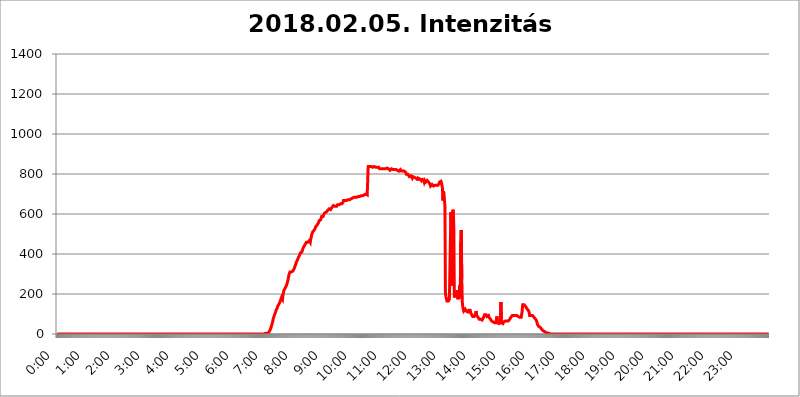
| Category | 2018.02.05. Intenzitás [W/m^2] |
|---|---|
| 0.0 | 0 |
| 0.0006944444444444445 | 0 |
| 0.001388888888888889 | 0 |
| 0.0020833333333333333 | 0 |
| 0.002777777777777778 | 0 |
| 0.003472222222222222 | 0 |
| 0.004166666666666667 | 0 |
| 0.004861111111111111 | 0 |
| 0.005555555555555556 | 0 |
| 0.0062499999999999995 | 0 |
| 0.006944444444444444 | 0 |
| 0.007638888888888889 | 0 |
| 0.008333333333333333 | 0 |
| 0.009027777777777779 | 0 |
| 0.009722222222222222 | 0 |
| 0.010416666666666666 | 0 |
| 0.011111111111111112 | 0 |
| 0.011805555555555555 | 0 |
| 0.012499999999999999 | 0 |
| 0.013194444444444444 | 0 |
| 0.013888888888888888 | 0 |
| 0.014583333333333332 | 0 |
| 0.015277777777777777 | 0 |
| 0.015972222222222224 | 0 |
| 0.016666666666666666 | 0 |
| 0.017361111111111112 | 0 |
| 0.018055555555555557 | 0 |
| 0.01875 | 0 |
| 0.019444444444444445 | 0 |
| 0.02013888888888889 | 0 |
| 0.020833333333333332 | 0 |
| 0.02152777777777778 | 0 |
| 0.022222222222222223 | 0 |
| 0.02291666666666667 | 0 |
| 0.02361111111111111 | 0 |
| 0.024305555555555556 | 0 |
| 0.024999999999999998 | 0 |
| 0.025694444444444447 | 0 |
| 0.02638888888888889 | 0 |
| 0.027083333333333334 | 0 |
| 0.027777777777777776 | 0 |
| 0.02847222222222222 | 0 |
| 0.029166666666666664 | 0 |
| 0.029861111111111113 | 0 |
| 0.030555555555555555 | 0 |
| 0.03125 | 0 |
| 0.03194444444444445 | 0 |
| 0.03263888888888889 | 0 |
| 0.03333333333333333 | 0 |
| 0.034027777777777775 | 0 |
| 0.034722222222222224 | 0 |
| 0.035416666666666666 | 0 |
| 0.036111111111111115 | 0 |
| 0.03680555555555556 | 0 |
| 0.0375 | 0 |
| 0.03819444444444444 | 0 |
| 0.03888888888888889 | 0 |
| 0.03958333333333333 | 0 |
| 0.04027777777777778 | 0 |
| 0.04097222222222222 | 0 |
| 0.041666666666666664 | 0 |
| 0.042361111111111106 | 0 |
| 0.04305555555555556 | 0 |
| 0.043750000000000004 | 0 |
| 0.044444444444444446 | 0 |
| 0.04513888888888889 | 0 |
| 0.04583333333333334 | 0 |
| 0.04652777777777778 | 0 |
| 0.04722222222222222 | 0 |
| 0.04791666666666666 | 0 |
| 0.04861111111111111 | 0 |
| 0.049305555555555554 | 0 |
| 0.049999999999999996 | 0 |
| 0.05069444444444445 | 0 |
| 0.051388888888888894 | 0 |
| 0.052083333333333336 | 0 |
| 0.05277777777777778 | 0 |
| 0.05347222222222222 | 0 |
| 0.05416666666666667 | 0 |
| 0.05486111111111111 | 0 |
| 0.05555555555555555 | 0 |
| 0.05625 | 0 |
| 0.05694444444444444 | 0 |
| 0.057638888888888885 | 0 |
| 0.05833333333333333 | 0 |
| 0.05902777777777778 | 0 |
| 0.059722222222222225 | 0 |
| 0.06041666666666667 | 0 |
| 0.061111111111111116 | 0 |
| 0.06180555555555556 | 0 |
| 0.0625 | 0 |
| 0.06319444444444444 | 0 |
| 0.06388888888888888 | 0 |
| 0.06458333333333334 | 0 |
| 0.06527777777777778 | 0 |
| 0.06597222222222222 | 0 |
| 0.06666666666666667 | 0 |
| 0.06736111111111111 | 0 |
| 0.06805555555555555 | 0 |
| 0.06874999999999999 | 0 |
| 0.06944444444444443 | 0 |
| 0.07013888888888889 | 0 |
| 0.07083333333333333 | 0 |
| 0.07152777777777779 | 0 |
| 0.07222222222222223 | 0 |
| 0.07291666666666667 | 0 |
| 0.07361111111111111 | 0 |
| 0.07430555555555556 | 0 |
| 0.075 | 0 |
| 0.07569444444444444 | 0 |
| 0.0763888888888889 | 0 |
| 0.07708333333333334 | 0 |
| 0.07777777777777778 | 0 |
| 0.07847222222222222 | 0 |
| 0.07916666666666666 | 0 |
| 0.0798611111111111 | 0 |
| 0.08055555555555556 | 0 |
| 0.08125 | 0 |
| 0.08194444444444444 | 0 |
| 0.08263888888888889 | 0 |
| 0.08333333333333333 | 0 |
| 0.08402777777777777 | 0 |
| 0.08472222222222221 | 0 |
| 0.08541666666666665 | 0 |
| 0.08611111111111112 | 0 |
| 0.08680555555555557 | 0 |
| 0.08750000000000001 | 0 |
| 0.08819444444444445 | 0 |
| 0.08888888888888889 | 0 |
| 0.08958333333333333 | 0 |
| 0.09027777777777778 | 0 |
| 0.09097222222222222 | 0 |
| 0.09166666666666667 | 0 |
| 0.09236111111111112 | 0 |
| 0.09305555555555556 | 0 |
| 0.09375 | 0 |
| 0.09444444444444444 | 0 |
| 0.09513888888888888 | 0 |
| 0.09583333333333333 | 0 |
| 0.09652777777777777 | 0 |
| 0.09722222222222222 | 0 |
| 0.09791666666666667 | 0 |
| 0.09861111111111111 | 0 |
| 0.09930555555555555 | 0 |
| 0.09999999999999999 | 0 |
| 0.10069444444444443 | 0 |
| 0.1013888888888889 | 0 |
| 0.10208333333333335 | 0 |
| 0.10277777777777779 | 0 |
| 0.10347222222222223 | 0 |
| 0.10416666666666667 | 0 |
| 0.10486111111111111 | 0 |
| 0.10555555555555556 | 0 |
| 0.10625 | 0 |
| 0.10694444444444444 | 0 |
| 0.1076388888888889 | 0 |
| 0.10833333333333334 | 0 |
| 0.10902777777777778 | 0 |
| 0.10972222222222222 | 0 |
| 0.1111111111111111 | 0 |
| 0.11180555555555556 | 0 |
| 0.11180555555555556 | 0 |
| 0.1125 | 0 |
| 0.11319444444444444 | 0 |
| 0.11388888888888889 | 0 |
| 0.11458333333333333 | 0 |
| 0.11527777777777777 | 0 |
| 0.11597222222222221 | 0 |
| 0.11666666666666665 | 0 |
| 0.1173611111111111 | 0 |
| 0.11805555555555557 | 0 |
| 0.11944444444444445 | 0 |
| 0.12013888888888889 | 0 |
| 0.12083333333333333 | 0 |
| 0.12152777777777778 | 0 |
| 0.12222222222222223 | 0 |
| 0.12291666666666667 | 0 |
| 0.12291666666666667 | 0 |
| 0.12361111111111112 | 0 |
| 0.12430555555555556 | 0 |
| 0.125 | 0 |
| 0.12569444444444444 | 0 |
| 0.12638888888888888 | 0 |
| 0.12708333333333333 | 0 |
| 0.16875 | 0 |
| 0.12847222222222224 | 0 |
| 0.12916666666666668 | 0 |
| 0.12986111111111112 | 0 |
| 0.13055555555555556 | 0 |
| 0.13125 | 0 |
| 0.13194444444444445 | 0 |
| 0.1326388888888889 | 0 |
| 0.13333333333333333 | 0 |
| 0.13402777777777777 | 0 |
| 0.13402777777777777 | 0 |
| 0.13472222222222222 | 0 |
| 0.13541666666666666 | 0 |
| 0.1361111111111111 | 0 |
| 0.13749999999999998 | 0 |
| 0.13819444444444443 | 0 |
| 0.1388888888888889 | 0 |
| 0.13958333333333334 | 0 |
| 0.14027777777777778 | 0 |
| 0.14097222222222222 | 0 |
| 0.14166666666666666 | 0 |
| 0.1423611111111111 | 0 |
| 0.14305555555555557 | 0 |
| 0.14375000000000002 | 0 |
| 0.14444444444444446 | 0 |
| 0.1451388888888889 | 0 |
| 0.1451388888888889 | 0 |
| 0.14652777777777778 | 0 |
| 0.14722222222222223 | 0 |
| 0.14791666666666667 | 0 |
| 0.1486111111111111 | 0 |
| 0.14930555555555555 | 0 |
| 0.15 | 0 |
| 0.15069444444444444 | 0 |
| 0.15138888888888888 | 0 |
| 0.15208333333333332 | 0 |
| 0.15277777777777776 | 0 |
| 0.15347222222222223 | 0 |
| 0.15416666666666667 | 0 |
| 0.15486111111111112 | 0 |
| 0.15555555555555556 | 0 |
| 0.15625 | 0 |
| 0.15694444444444444 | 0 |
| 0.15763888888888888 | 0 |
| 0.15833333333333333 | 0 |
| 0.15902777777777777 | 0 |
| 0.15972222222222224 | 0 |
| 0.16041666666666668 | 0 |
| 0.16111111111111112 | 0 |
| 0.16180555555555556 | 0 |
| 0.1625 | 0 |
| 0.16319444444444445 | 0 |
| 0.1638888888888889 | 0 |
| 0.16458333333333333 | 0 |
| 0.16527777777777777 | 0 |
| 0.16597222222222222 | 0 |
| 0.16666666666666666 | 0 |
| 0.1673611111111111 | 0 |
| 0.16805555555555554 | 0 |
| 0.16874999999999998 | 0 |
| 0.16944444444444443 | 0 |
| 0.17013888888888887 | 0 |
| 0.1708333333333333 | 0 |
| 0.17152777777777775 | 0 |
| 0.17222222222222225 | 0 |
| 0.1729166666666667 | 0 |
| 0.17361111111111113 | 0 |
| 0.17430555555555557 | 0 |
| 0.17500000000000002 | 0 |
| 0.17569444444444446 | 0 |
| 0.1763888888888889 | 0 |
| 0.17708333333333334 | 0 |
| 0.17777777777777778 | 0 |
| 0.17847222222222223 | 0 |
| 0.17916666666666667 | 0 |
| 0.1798611111111111 | 0 |
| 0.18055555555555555 | 0 |
| 0.18125 | 0 |
| 0.18194444444444444 | 0 |
| 0.1826388888888889 | 0 |
| 0.18333333333333335 | 0 |
| 0.1840277777777778 | 0 |
| 0.18472222222222223 | 0 |
| 0.18541666666666667 | 0 |
| 0.18611111111111112 | 0 |
| 0.18680555555555556 | 0 |
| 0.1875 | 0 |
| 0.18819444444444444 | 0 |
| 0.18888888888888888 | 0 |
| 0.18958333333333333 | 0 |
| 0.19027777777777777 | 0 |
| 0.1909722222222222 | 0 |
| 0.19166666666666665 | 0 |
| 0.19236111111111112 | 0 |
| 0.19305555555555554 | 0 |
| 0.19375 | 0 |
| 0.19444444444444445 | 0 |
| 0.1951388888888889 | 0 |
| 0.19583333333333333 | 0 |
| 0.19652777777777777 | 0 |
| 0.19722222222222222 | 0 |
| 0.19791666666666666 | 0 |
| 0.1986111111111111 | 0 |
| 0.19930555555555554 | 0 |
| 0.19999999999999998 | 0 |
| 0.20069444444444443 | 0 |
| 0.20138888888888887 | 0 |
| 0.2020833333333333 | 0 |
| 0.2027777777777778 | 0 |
| 0.2034722222222222 | 0 |
| 0.2041666666666667 | 0 |
| 0.20486111111111113 | 0 |
| 0.20555555555555557 | 0 |
| 0.20625000000000002 | 0 |
| 0.20694444444444446 | 0 |
| 0.2076388888888889 | 0 |
| 0.20833333333333334 | 0 |
| 0.20902777777777778 | 0 |
| 0.20972222222222223 | 0 |
| 0.21041666666666667 | 0 |
| 0.2111111111111111 | 0 |
| 0.21180555555555555 | 0 |
| 0.2125 | 0 |
| 0.21319444444444444 | 0 |
| 0.2138888888888889 | 0 |
| 0.21458333333333335 | 0 |
| 0.2152777777777778 | 0 |
| 0.21597222222222223 | 0 |
| 0.21666666666666667 | 0 |
| 0.21736111111111112 | 0 |
| 0.21805555555555556 | 0 |
| 0.21875 | 0 |
| 0.21944444444444444 | 0 |
| 0.22013888888888888 | 0 |
| 0.22083333333333333 | 0 |
| 0.22152777777777777 | 0 |
| 0.2222222222222222 | 0 |
| 0.22291666666666665 | 0 |
| 0.2236111111111111 | 0 |
| 0.22430555555555556 | 0 |
| 0.225 | 0 |
| 0.22569444444444445 | 0 |
| 0.2263888888888889 | 0 |
| 0.22708333333333333 | 0 |
| 0.22777777777777777 | 0 |
| 0.22847222222222222 | 0 |
| 0.22916666666666666 | 0 |
| 0.2298611111111111 | 0 |
| 0.23055555555555554 | 0 |
| 0.23124999999999998 | 0 |
| 0.23194444444444443 | 0 |
| 0.23263888888888887 | 0 |
| 0.2333333333333333 | 0 |
| 0.2340277777777778 | 0 |
| 0.2347222222222222 | 0 |
| 0.2354166666666667 | 0 |
| 0.23611111111111113 | 0 |
| 0.23680555555555557 | 0 |
| 0.23750000000000002 | 0 |
| 0.23819444444444446 | 0 |
| 0.2388888888888889 | 0 |
| 0.23958333333333334 | 0 |
| 0.24027777777777778 | 0 |
| 0.24097222222222223 | 0 |
| 0.24166666666666667 | 0 |
| 0.2423611111111111 | 0 |
| 0.24305555555555555 | 0 |
| 0.24375 | 0 |
| 0.24444444444444446 | 0 |
| 0.24513888888888888 | 0 |
| 0.24583333333333335 | 0 |
| 0.2465277777777778 | 0 |
| 0.24722222222222223 | 0 |
| 0.24791666666666667 | 0 |
| 0.24861111111111112 | 0 |
| 0.24930555555555556 | 0 |
| 0.25 | 0 |
| 0.25069444444444444 | 0 |
| 0.2513888888888889 | 0 |
| 0.2520833333333333 | 0 |
| 0.25277777777777777 | 0 |
| 0.2534722222222222 | 0 |
| 0.25416666666666665 | 0 |
| 0.2548611111111111 | 0 |
| 0.2555555555555556 | 0 |
| 0.25625000000000003 | 0 |
| 0.2569444444444445 | 0 |
| 0.2576388888888889 | 0 |
| 0.25833333333333336 | 0 |
| 0.2590277777777778 | 0 |
| 0.25972222222222224 | 0 |
| 0.2604166666666667 | 0 |
| 0.2611111111111111 | 0 |
| 0.26180555555555557 | 0 |
| 0.2625 | 0 |
| 0.26319444444444445 | 0 |
| 0.2638888888888889 | 0 |
| 0.26458333333333334 | 0 |
| 0.2652777777777778 | 0 |
| 0.2659722222222222 | 0 |
| 0.26666666666666666 | 0 |
| 0.2673611111111111 | 0 |
| 0.26805555555555555 | 0 |
| 0.26875 | 0 |
| 0.26944444444444443 | 0 |
| 0.2701388888888889 | 0 |
| 0.2708333333333333 | 0 |
| 0.27152777777777776 | 0 |
| 0.2722222222222222 | 0 |
| 0.27291666666666664 | 0 |
| 0.2736111111111111 | 0 |
| 0.2743055555555555 | 0 |
| 0.27499999999999997 | 0 |
| 0.27569444444444446 | 0 |
| 0.27638888888888885 | 0 |
| 0.27708333333333335 | 0 |
| 0.2777777777777778 | 0 |
| 0.27847222222222223 | 0 |
| 0.2791666666666667 | 0 |
| 0.2798611111111111 | 0 |
| 0.28055555555555556 | 0 |
| 0.28125 | 0 |
| 0.28194444444444444 | 0 |
| 0.2826388888888889 | 0 |
| 0.2833333333333333 | 0 |
| 0.28402777777777777 | 0 |
| 0.2847222222222222 | 0 |
| 0.28541666666666665 | 0 |
| 0.28611111111111115 | 0 |
| 0.28680555555555554 | 0 |
| 0.28750000000000003 | 0 |
| 0.2881944444444445 | 0 |
| 0.2888888888888889 | 0 |
| 0.28958333333333336 | 0 |
| 0.2902777777777778 | 0 |
| 0.29097222222222224 | 3.525 |
| 0.2916666666666667 | 3.525 |
| 0.2923611111111111 | 3.525 |
| 0.29305555555555557 | 3.525 |
| 0.29375 | 3.525 |
| 0.29444444444444445 | 3.525 |
| 0.2951388888888889 | 7.887 |
| 0.29583333333333334 | 3.525 |
| 0.2965277777777778 | 7.887 |
| 0.2972222222222222 | 12.257 |
| 0.29791666666666666 | 12.257 |
| 0.2986111111111111 | 21.024 |
| 0.29930555555555555 | 25.419 |
| 0.3 | 34.234 |
| 0.30069444444444443 | 43.079 |
| 0.3013888888888889 | 51.951 |
| 0.3020833333333333 | 60.85 |
| 0.30277777777777776 | 74.246 |
| 0.3034722222222222 | 83.205 |
| 0.30416666666666664 | 87.692 |
| 0.3048611111111111 | 96.682 |
| 0.3055555555555555 | 101.184 |
| 0.30624999999999997 | 110.201 |
| 0.3069444444444444 | 119.235 |
| 0.3076388888888889 | 123.758 |
| 0.30833333333333335 | 128.284 |
| 0.3090277777777778 | 137.347 |
| 0.30972222222222223 | 141.884 |
| 0.3104166666666667 | 146.423 |
| 0.3111111111111111 | 150.964 |
| 0.31180555555555556 | 155.509 |
| 0.3125 | 160.056 |
| 0.31319444444444444 | 169.156 |
| 0.3138888888888889 | 173.709 |
| 0.3145833333333333 | 182.82 |
| 0.31527777777777777 | 187.378 |
| 0.3159722222222222 | 173.709 |
| 0.31666666666666665 | 196.497 |
| 0.31736111111111115 | 210.182 |
| 0.31805555555555554 | 219.309 |
| 0.31875000000000003 | 223.873 |
| 0.3194444444444445 | 228.436 |
| 0.3201388888888889 | 233 |
| 0.32083333333333336 | 237.564 |
| 0.3215277777777778 | 242.127 |
| 0.32222222222222224 | 251.251 |
| 0.3229166666666667 | 260.373 |
| 0.3236111111111111 | 269.49 |
| 0.32430555555555557 | 283.156 |
| 0.325 | 296.808 |
| 0.32569444444444445 | 301.354 |
| 0.3263888888888889 | 310.44 |
| 0.32708333333333334 | 310.44 |
| 0.3277777777777778 | 314.98 |
| 0.3284722222222222 | 310.44 |
| 0.32916666666666666 | 314.98 |
| 0.3298611111111111 | 314.98 |
| 0.33055555555555555 | 314.98 |
| 0.33125 | 314.98 |
| 0.33194444444444443 | 324.052 |
| 0.3326388888888889 | 328.584 |
| 0.3333333333333333 | 337.639 |
| 0.3340277777777778 | 342.162 |
| 0.3347222222222222 | 351.198 |
| 0.3354166666666667 | 360.221 |
| 0.3361111111111111 | 364.728 |
| 0.3368055555555556 | 369.23 |
| 0.33749999999999997 | 373.729 |
| 0.33819444444444446 | 382.715 |
| 0.33888888888888885 | 387.202 |
| 0.33958333333333335 | 391.685 |
| 0.34027777777777773 | 396.164 |
| 0.34097222222222223 | 405.108 |
| 0.3416666666666666 | 405.108 |
| 0.3423611111111111 | 409.574 |
| 0.3430555555555555 | 409.574 |
| 0.34375 | 418.492 |
| 0.3444444444444445 | 422.943 |
| 0.3451388888888889 | 431.833 |
| 0.3458333333333334 | 436.27 |
| 0.34652777777777777 | 440.702 |
| 0.34722222222222227 | 445.129 |
| 0.34791666666666665 | 449.551 |
| 0.34861111111111115 | 453.968 |
| 0.34930555555555554 | 458.38 |
| 0.35000000000000003 | 458.38 |
| 0.3506944444444444 | 462.786 |
| 0.3513888888888889 | 458.38 |
| 0.3520833333333333 | 458.38 |
| 0.3527777777777778 | 462.786 |
| 0.3534722222222222 | 467.187 |
| 0.3541666666666667 | 462.786 |
| 0.3548611111111111 | 458.38 |
| 0.35555555555555557 | 475.972 |
| 0.35625 | 484.735 |
| 0.35694444444444445 | 497.836 |
| 0.3576388888888889 | 502.192 |
| 0.35833333333333334 | 510.885 |
| 0.3590277777777778 | 515.223 |
| 0.3597222222222222 | 515.223 |
| 0.36041666666666666 | 519.555 |
| 0.3611111111111111 | 523.88 |
| 0.36180555555555555 | 528.2 |
| 0.3625 | 536.82 |
| 0.36319444444444443 | 541.121 |
| 0.3638888888888889 | 541.121 |
| 0.3645833333333333 | 545.416 |
| 0.3652777777777778 | 545.416 |
| 0.3659722222222222 | 549.704 |
| 0.3666666666666667 | 558.261 |
| 0.3673611111111111 | 566.793 |
| 0.3680555555555556 | 566.793 |
| 0.36874999999999997 | 571.049 |
| 0.36944444444444446 | 571.049 |
| 0.37013888888888885 | 575.299 |
| 0.37083333333333335 | 588.009 |
| 0.37152777777777773 | 588.009 |
| 0.37222222222222223 | 583.779 |
| 0.3729166666666666 | 588.009 |
| 0.3736111111111111 | 596.45 |
| 0.3743055555555555 | 600.661 |
| 0.375 | 604.864 |
| 0.3756944444444445 | 600.661 |
| 0.3763888888888889 | 604.864 |
| 0.3770833333333334 | 609.062 |
| 0.37777777777777777 | 609.062 |
| 0.37847222222222227 | 609.062 |
| 0.37916666666666665 | 617.436 |
| 0.37986111111111115 | 617.436 |
| 0.38055555555555554 | 617.436 |
| 0.38125000000000003 | 625.784 |
| 0.3819444444444444 | 621.613 |
| 0.3826388888888889 | 625.784 |
| 0.3833333333333333 | 621.613 |
| 0.3840277777777778 | 621.613 |
| 0.3847222222222222 | 625.784 |
| 0.3854166666666667 | 634.105 |
| 0.3861111111111111 | 634.105 |
| 0.38680555555555557 | 638.256 |
| 0.3875 | 642.4 |
| 0.38819444444444445 | 638.256 |
| 0.3888888888888889 | 642.4 |
| 0.38958333333333334 | 638.256 |
| 0.3902777777777778 | 638.256 |
| 0.3909722222222222 | 638.256 |
| 0.39166666666666666 | 638.256 |
| 0.3923611111111111 | 638.256 |
| 0.39305555555555555 | 646.537 |
| 0.39375 | 646.537 |
| 0.39444444444444443 | 646.537 |
| 0.3951388888888889 | 646.537 |
| 0.3958333333333333 | 642.4 |
| 0.3965277777777778 | 646.537 |
| 0.3972222222222222 | 650.667 |
| 0.3979166666666667 | 646.537 |
| 0.3986111111111111 | 646.537 |
| 0.3993055555555556 | 650.667 |
| 0.39999999999999997 | 654.791 |
| 0.40069444444444446 | 658.909 |
| 0.40138888888888885 | 667.123 |
| 0.40208333333333335 | 667.123 |
| 0.40277777777777773 | 667.123 |
| 0.40347222222222223 | 667.123 |
| 0.4041666666666666 | 667.123 |
| 0.4048611111111111 | 667.123 |
| 0.4055555555555555 | 667.123 |
| 0.40625 | 667.123 |
| 0.4069444444444445 | 671.22 |
| 0.4076388888888889 | 671.22 |
| 0.4083333333333334 | 671.22 |
| 0.40902777777777777 | 671.22 |
| 0.40972222222222227 | 671.22 |
| 0.41041666666666665 | 667.123 |
| 0.41111111111111115 | 671.22 |
| 0.41180555555555554 | 675.311 |
| 0.41250000000000003 | 675.311 |
| 0.4131944444444444 | 675.311 |
| 0.4138888888888889 | 679.395 |
| 0.4145833333333333 | 679.395 |
| 0.4152777777777778 | 679.395 |
| 0.4159722222222222 | 683.473 |
| 0.4166666666666667 | 683.473 |
| 0.4173611111111111 | 683.473 |
| 0.41805555555555557 | 683.473 |
| 0.41875 | 687.544 |
| 0.41944444444444445 | 687.544 |
| 0.4201388888888889 | 683.473 |
| 0.42083333333333334 | 687.544 |
| 0.4215277777777778 | 687.544 |
| 0.4222222222222222 | 687.544 |
| 0.42291666666666666 | 687.544 |
| 0.4236111111111111 | 687.544 |
| 0.42430555555555555 | 687.544 |
| 0.425 | 687.544 |
| 0.42569444444444443 | 691.608 |
| 0.4263888888888889 | 691.608 |
| 0.4270833333333333 | 691.608 |
| 0.4277777777777778 | 691.608 |
| 0.4284722222222222 | 691.608 |
| 0.4291666666666667 | 695.666 |
| 0.4298611111111111 | 695.666 |
| 0.4305555555555556 | 695.666 |
| 0.43124999999999997 | 695.666 |
| 0.43194444444444446 | 695.666 |
| 0.43263888888888885 | 699.717 |
| 0.43333333333333335 | 699.717 |
| 0.43402777777777773 | 699.717 |
| 0.43472222222222223 | 695.666 |
| 0.4354166666666666 | 695.666 |
| 0.4361111111111111 | 837.682 |
| 0.4368055555555555 | 837.682 |
| 0.4375 | 837.682 |
| 0.4381944444444445 | 837.682 |
| 0.4388888888888889 | 837.682 |
| 0.4395833333333334 | 833.834 |
| 0.44027777777777777 | 837.682 |
| 0.44097222222222227 | 837.682 |
| 0.44166666666666665 | 837.682 |
| 0.44236111111111115 | 833.834 |
| 0.44305555555555554 | 829.981 |
| 0.44375000000000003 | 837.682 |
| 0.4444444444444444 | 837.682 |
| 0.4451388888888889 | 837.682 |
| 0.4458333333333333 | 833.834 |
| 0.4465277777777778 | 833.834 |
| 0.4472222222222222 | 833.834 |
| 0.4479166666666667 | 833.834 |
| 0.4486111111111111 | 833.834 |
| 0.44930555555555557 | 829.981 |
| 0.45 | 829.981 |
| 0.45069444444444445 | 833.834 |
| 0.4513888888888889 | 829.981 |
| 0.45208333333333334 | 826.123 |
| 0.4527777777777778 | 826.123 |
| 0.4534722222222222 | 826.123 |
| 0.45416666666666666 | 826.123 |
| 0.4548611111111111 | 826.123 |
| 0.45555555555555555 | 826.123 |
| 0.45625 | 826.123 |
| 0.45694444444444443 | 822.26 |
| 0.4576388888888889 | 826.123 |
| 0.4583333333333333 | 826.123 |
| 0.4590277777777778 | 822.26 |
| 0.4597222222222222 | 826.123 |
| 0.4604166666666667 | 826.123 |
| 0.4611111111111111 | 829.981 |
| 0.4618055555555556 | 829.981 |
| 0.46249999999999997 | 829.981 |
| 0.46319444444444446 | 829.981 |
| 0.46388888888888885 | 826.123 |
| 0.46458333333333335 | 826.123 |
| 0.46527777777777773 | 826.123 |
| 0.46597222222222223 | 822.26 |
| 0.4666666666666666 | 818.392 |
| 0.4673611111111111 | 822.26 |
| 0.4680555555555555 | 822.26 |
| 0.46875 | 826.123 |
| 0.4694444444444445 | 826.123 |
| 0.4701388888888889 | 822.26 |
| 0.4708333333333334 | 822.26 |
| 0.47152777777777777 | 822.26 |
| 0.47222222222222227 | 822.26 |
| 0.47291666666666665 | 822.26 |
| 0.47361111111111115 | 822.26 |
| 0.47430555555555554 | 818.392 |
| 0.47500000000000003 | 822.26 |
| 0.4756944444444444 | 822.26 |
| 0.4763888888888889 | 818.392 |
| 0.4770833333333333 | 818.392 |
| 0.4777777777777778 | 814.519 |
| 0.4784722222222222 | 814.519 |
| 0.4791666666666667 | 814.519 |
| 0.4798611111111111 | 814.519 |
| 0.48055555555555557 | 818.392 |
| 0.48125 | 822.26 |
| 0.48194444444444445 | 818.392 |
| 0.4826388888888889 | 814.519 |
| 0.48333333333333334 | 818.392 |
| 0.4840277777777778 | 818.392 |
| 0.4847222222222222 | 814.519 |
| 0.48541666666666666 | 814.519 |
| 0.4861111111111111 | 814.519 |
| 0.48680555555555555 | 814.519 |
| 0.4875 | 814.519 |
| 0.48819444444444443 | 814.519 |
| 0.4888888888888889 | 806.757 |
| 0.4895833333333333 | 798.974 |
| 0.4902777777777778 | 795.074 |
| 0.4909722222222222 | 795.074 |
| 0.4916666666666667 | 798.974 |
| 0.4923611111111111 | 795.074 |
| 0.4930555555555556 | 795.074 |
| 0.49374999999999997 | 787.258 |
| 0.49444444444444446 | 791.169 |
| 0.49513888888888885 | 787.258 |
| 0.49583333333333335 | 791.169 |
| 0.49652777777777773 | 791.169 |
| 0.49722222222222223 | 791.169 |
| 0.4979166666666666 | 779.42 |
| 0.4986111111111111 | 787.258 |
| 0.4993055555555555 | 783.342 |
| 0.5 | 783.342 |
| 0.5006944444444444 | 783.342 |
| 0.5013888888888889 | 783.342 |
| 0.5020833333333333 | 787.258 |
| 0.5027777777777778 | 779.42 |
| 0.5034722222222222 | 775.492 |
| 0.5041666666666667 | 779.42 |
| 0.5048611111111111 | 775.492 |
| 0.5055555555555555 | 767.62 |
| 0.50625 | 779.42 |
| 0.5069444444444444 | 783.342 |
| 0.5076388888888889 | 779.42 |
| 0.5083333333333333 | 775.492 |
| 0.5090277777777777 | 775.492 |
| 0.5097222222222222 | 771.559 |
| 0.5104166666666666 | 767.62 |
| 0.5111111111111112 | 779.42 |
| 0.5118055555555555 | 771.559 |
| 0.5125000000000001 | 771.559 |
| 0.5131944444444444 | 771.559 |
| 0.513888888888889 | 767.62 |
| 0.5145833333333333 | 759.723 |
| 0.5152777777777778 | 767.62 |
| 0.5159722222222222 | 763.674 |
| 0.5166666666666667 | 759.723 |
| 0.517361111111111 | 759.723 |
| 0.5180555555555556 | 763.674 |
| 0.5187499999999999 | 767.62 |
| 0.5194444444444445 | 767.62 |
| 0.5201388888888888 | 767.62 |
| 0.5208333333333334 | 759.723 |
| 0.5215277777777778 | 755.766 |
| 0.5222222222222223 | 755.766 |
| 0.5229166666666667 | 747.834 |
| 0.5236111111111111 | 739.877 |
| 0.5243055555555556 | 743.859 |
| 0.525 | 743.859 |
| 0.5256944444444445 | 747.834 |
| 0.5263888888888889 | 743.859 |
| 0.5270833333333333 | 743.859 |
| 0.5277777777777778 | 739.877 |
| 0.5284722222222222 | 739.877 |
| 0.5291666666666667 | 739.877 |
| 0.5298611111111111 | 743.859 |
| 0.5305555555555556 | 739.877 |
| 0.53125 | 743.859 |
| 0.5319444444444444 | 743.859 |
| 0.5326388888888889 | 743.859 |
| 0.5333333333333333 | 747.834 |
| 0.5340277777777778 | 743.859 |
| 0.5347222222222222 | 743.859 |
| 0.5354166666666667 | 751.803 |
| 0.5361111111111111 | 759.723 |
| 0.5368055555555555 | 755.766 |
| 0.5375 | 755.766 |
| 0.5381944444444444 | 763.674 |
| 0.5388888888888889 | 755.766 |
| 0.5395833333333333 | 743.859 |
| 0.5402777777777777 | 727.896 |
| 0.5409722222222222 | 667.123 |
| 0.5416666666666666 | 711.832 |
| 0.5423611111111112 | 699.717 |
| 0.5430555555555555 | 699.717 |
| 0.5437500000000001 | 638.256 |
| 0.5444444444444444 | 201.058 |
| 0.545138888888889 | 187.378 |
| 0.5458333333333333 | 178.264 |
| 0.5465277777777778 | 164.605 |
| 0.5472222222222222 | 160.056 |
| 0.5479166666666667 | 169.156 |
| 0.548611111111111 | 164.605 |
| 0.5493055555555556 | 169.156 |
| 0.5499999999999999 | 173.709 |
| 0.5506944444444445 | 173.709 |
| 0.5513888888888888 | 173.709 |
| 0.5520833333333334 | 609.062 |
| 0.5527777777777778 | 532.513 |
| 0.5534722222222223 | 242.127 |
| 0.5541666666666667 | 532.513 |
| 0.5548611111111111 | 621.613 |
| 0.5555555555555556 | 609.062 |
| 0.55625 | 528.2 |
| 0.5569444444444445 | 182.82 |
| 0.5576388888888889 | 210.182 |
| 0.5583333333333333 | 196.497 |
| 0.5590277777777778 | 201.058 |
| 0.5597222222222222 | 201.058 |
| 0.5604166666666667 | 191.937 |
| 0.5611111111111111 | 219.309 |
| 0.5618055555555556 | 173.709 |
| 0.5625 | 173.709 |
| 0.5631944444444444 | 187.378 |
| 0.5638888888888889 | 191.937 |
| 0.5645833333333333 | 242.127 |
| 0.5652777777777778 | 178.264 |
| 0.5659722222222222 | 458.38 |
| 0.5666666666666667 | 519.555 |
| 0.5673611111111111 | 274.047 |
| 0.5680555555555555 | 160.056 |
| 0.56875 | 137.347 |
| 0.5694444444444444 | 123.758 |
| 0.5701388888888889 | 114.716 |
| 0.5708333333333333 | 110.201 |
| 0.5715277777777777 | 114.716 |
| 0.5722222222222222 | 123.758 |
| 0.5729166666666666 | 119.235 |
| 0.5736111111111112 | 114.716 |
| 0.5743055555555555 | 110.201 |
| 0.5750000000000001 | 110.201 |
| 0.5756944444444444 | 110.201 |
| 0.576388888888889 | 114.716 |
| 0.5770833333333333 | 119.235 |
| 0.5777777777777778 | 119.235 |
| 0.5784722222222222 | 119.235 |
| 0.5791666666666667 | 119.235 |
| 0.579861111111111 | 105.69 |
| 0.5805555555555556 | 101.184 |
| 0.5812499999999999 | 96.682 |
| 0.5819444444444445 | 92.184 |
| 0.5826388888888888 | 87.692 |
| 0.5833333333333334 | 87.692 |
| 0.5840277777777778 | 87.692 |
| 0.5847222222222223 | 87.692 |
| 0.5854166666666667 | 83.205 |
| 0.5861111111111111 | 87.692 |
| 0.5868055555555556 | 101.184 |
| 0.5875 | 114.716 |
| 0.5881944444444445 | 92.184 |
| 0.5888888888888889 | 92.184 |
| 0.5895833333333333 | 87.692 |
| 0.5902777777777778 | 83.205 |
| 0.5909722222222222 | 78.722 |
| 0.5916666666666667 | 74.246 |
| 0.5923611111111111 | 74.246 |
| 0.5930555555555556 | 74.246 |
| 0.59375 | 74.246 |
| 0.5944444444444444 | 69.775 |
| 0.5951388888888889 | 74.246 |
| 0.5958333333333333 | 69.775 |
| 0.5965277777777778 | 74.246 |
| 0.5972222222222222 | 78.722 |
| 0.5979166666666667 | 83.205 |
| 0.5986111111111111 | 87.692 |
| 0.5993055555555555 | 96.682 |
| 0.6 | 101.184 |
| 0.6006944444444444 | 101.184 |
| 0.6013888888888889 | 96.682 |
| 0.6020833333333333 | 92.184 |
| 0.6027777777777777 | 87.692 |
| 0.6034722222222222 | 87.692 |
| 0.6041666666666666 | 87.692 |
| 0.6048611111111112 | 92.184 |
| 0.6055555555555555 | 83.205 |
| 0.6062500000000001 | 83.205 |
| 0.6069444444444444 | 78.722 |
| 0.607638888888889 | 74.246 |
| 0.6083333333333333 | 69.775 |
| 0.6090277777777778 | 65.31 |
| 0.6097222222222222 | 65.31 |
| 0.6104166666666667 | 60.85 |
| 0.611111111111111 | 60.85 |
| 0.6118055555555556 | 56.398 |
| 0.6124999999999999 | 56.398 |
| 0.6131944444444445 | 56.398 |
| 0.6138888888888888 | 56.398 |
| 0.6145833333333334 | 56.398 |
| 0.6152777777777778 | 56.398 |
| 0.6159722222222223 | 60.85 |
| 0.6166666666666667 | 87.692 |
| 0.6173611111111111 | 56.398 |
| 0.6180555555555556 | 51.951 |
| 0.61875 | 51.951 |
| 0.6194444444444445 | 51.951 |
| 0.6201388888888889 | 51.951 |
| 0.6208333333333333 | 51.951 |
| 0.6215277777777778 | 56.398 |
| 0.6222222222222222 | 160.056 |
| 0.6229166666666667 | 56.398 |
| 0.6236111111111111 | 51.951 |
| 0.6243055555555556 | 51.951 |
| 0.625 | 51.951 |
| 0.6256944444444444 | 56.398 |
| 0.6263888888888889 | 60.85 |
| 0.6270833333333333 | 65.31 |
| 0.6277777777777778 | 65.31 |
| 0.6284722222222222 | 65.31 |
| 0.6291666666666667 | 69.775 |
| 0.6298611111111111 | 65.31 |
| 0.6305555555555555 | 65.31 |
| 0.63125 | 65.31 |
| 0.6319444444444444 | 65.31 |
| 0.6326388888888889 | 65.31 |
| 0.6333333333333333 | 65.31 |
| 0.6340277777777777 | 69.775 |
| 0.6347222222222222 | 74.246 |
| 0.6354166666666666 | 78.722 |
| 0.6361111111111112 | 83.205 |
| 0.6368055555555555 | 87.692 |
| 0.6375000000000001 | 87.692 |
| 0.6381944444444444 | 92.184 |
| 0.638888888888889 | 92.184 |
| 0.6395833333333333 | 92.184 |
| 0.6402777777777778 | 92.184 |
| 0.6409722222222222 | 92.184 |
| 0.6416666666666667 | 92.184 |
| 0.642361111111111 | 92.184 |
| 0.6430555555555556 | 92.184 |
| 0.6437499999999999 | 92.184 |
| 0.6444444444444445 | 92.184 |
| 0.6451388888888888 | 87.692 |
| 0.6458333333333334 | 87.692 |
| 0.6465277777777778 | 87.692 |
| 0.6472222222222223 | 83.205 |
| 0.6479166666666667 | 83.205 |
| 0.6486111111111111 | 83.205 |
| 0.6493055555555556 | 78.722 |
| 0.65 | 78.722 |
| 0.6506944444444445 | 83.205 |
| 0.6513888888888889 | 87.692 |
| 0.6520833333333333 | 114.716 |
| 0.6527777777777778 | 146.423 |
| 0.6534722222222222 | 150.964 |
| 0.6541666666666667 | 150.964 |
| 0.6548611111111111 | 146.423 |
| 0.6555555555555556 | 146.423 |
| 0.65625 | 141.884 |
| 0.6569444444444444 | 137.347 |
| 0.6576388888888889 | 137.347 |
| 0.6583333333333333 | 128.284 |
| 0.6590277777777778 | 128.284 |
| 0.6597222222222222 | 123.758 |
| 0.6604166666666667 | 119.235 |
| 0.6611111111111111 | 114.716 |
| 0.6618055555555555 | 110.201 |
| 0.6625 | 92.184 |
| 0.6631944444444444 | 92.184 |
| 0.6638888888888889 | 96.682 |
| 0.6645833333333333 | 92.184 |
| 0.6652777777777777 | 92.184 |
| 0.6659722222222222 | 92.184 |
| 0.6666666666666666 | 92.184 |
| 0.6673611111111111 | 87.692 |
| 0.6680555555555556 | 87.692 |
| 0.6687500000000001 | 83.205 |
| 0.6694444444444444 | 83.205 |
| 0.6701388888888888 | 78.722 |
| 0.6708333333333334 | 74.246 |
| 0.6715277777777778 | 74.246 |
| 0.6722222222222222 | 65.31 |
| 0.6729166666666666 | 56.398 |
| 0.6736111111111112 | 47.511 |
| 0.6743055555555556 | 43.079 |
| 0.6749999999999999 | 38.653 |
| 0.6756944444444444 | 38.653 |
| 0.6763888888888889 | 34.234 |
| 0.6770833333333334 | 34.234 |
| 0.6777777777777777 | 29.823 |
| 0.6784722222222223 | 29.823 |
| 0.6791666666666667 | 25.419 |
| 0.6798611111111111 | 25.419 |
| 0.6805555555555555 | 21.024 |
| 0.68125 | 16.636 |
| 0.6819444444444445 | 16.636 |
| 0.6826388888888889 | 12.257 |
| 0.6833333333333332 | 12.257 |
| 0.6840277777777778 | 7.887 |
| 0.6847222222222222 | 7.887 |
| 0.6854166666666667 | 7.887 |
| 0.686111111111111 | 3.525 |
| 0.6868055555555556 | 3.525 |
| 0.6875 | 3.525 |
| 0.6881944444444444 | 3.525 |
| 0.688888888888889 | 3.525 |
| 0.6895833333333333 | 3.525 |
| 0.6902777777777778 | 0 |
| 0.6909722222222222 | 0 |
| 0.6916666666666668 | 0 |
| 0.6923611111111111 | 0 |
| 0.6930555555555555 | 0 |
| 0.69375 | 0 |
| 0.6944444444444445 | 0 |
| 0.6951388888888889 | 0 |
| 0.6958333333333333 | 0 |
| 0.6965277777777777 | 0 |
| 0.6972222222222223 | 0 |
| 0.6979166666666666 | 0 |
| 0.6986111111111111 | 0 |
| 0.6993055555555556 | 0 |
| 0.7000000000000001 | 0 |
| 0.7006944444444444 | 0 |
| 0.7013888888888888 | 0 |
| 0.7020833333333334 | 0 |
| 0.7027777777777778 | 0 |
| 0.7034722222222222 | 0 |
| 0.7041666666666666 | 0 |
| 0.7048611111111112 | 0 |
| 0.7055555555555556 | 0 |
| 0.7062499999999999 | 0 |
| 0.7069444444444444 | 0 |
| 0.7076388888888889 | 0 |
| 0.7083333333333334 | 0 |
| 0.7090277777777777 | 0 |
| 0.7097222222222223 | 0 |
| 0.7104166666666667 | 0 |
| 0.7111111111111111 | 0 |
| 0.7118055555555555 | 0 |
| 0.7125 | 0 |
| 0.7131944444444445 | 0 |
| 0.7138888888888889 | 0 |
| 0.7145833333333332 | 0 |
| 0.7152777777777778 | 0 |
| 0.7159722222222222 | 0 |
| 0.7166666666666667 | 0 |
| 0.717361111111111 | 0 |
| 0.7180555555555556 | 0 |
| 0.71875 | 0 |
| 0.7194444444444444 | 0 |
| 0.720138888888889 | 0 |
| 0.7208333333333333 | 0 |
| 0.7215277777777778 | 0 |
| 0.7222222222222222 | 0 |
| 0.7229166666666668 | 0 |
| 0.7236111111111111 | 0 |
| 0.7243055555555555 | 0 |
| 0.725 | 0 |
| 0.7256944444444445 | 0 |
| 0.7263888888888889 | 0 |
| 0.7270833333333333 | 0 |
| 0.7277777777777777 | 0 |
| 0.7284722222222223 | 0 |
| 0.7291666666666666 | 0 |
| 0.7298611111111111 | 0 |
| 0.7305555555555556 | 0 |
| 0.7312500000000001 | 0 |
| 0.7319444444444444 | 0 |
| 0.7326388888888888 | 0 |
| 0.7333333333333334 | 0 |
| 0.7340277777777778 | 0 |
| 0.7347222222222222 | 0 |
| 0.7354166666666666 | 0 |
| 0.7361111111111112 | 0 |
| 0.7368055555555556 | 0 |
| 0.7374999999999999 | 0 |
| 0.7381944444444444 | 0 |
| 0.7388888888888889 | 0 |
| 0.7395833333333334 | 0 |
| 0.7402777777777777 | 0 |
| 0.7409722222222223 | 0 |
| 0.7416666666666667 | 0 |
| 0.7423611111111111 | 0 |
| 0.7430555555555555 | 0 |
| 0.74375 | 0 |
| 0.7444444444444445 | 0 |
| 0.7451388888888889 | 0 |
| 0.7458333333333332 | 0 |
| 0.7465277777777778 | 0 |
| 0.7472222222222222 | 0 |
| 0.7479166666666667 | 0 |
| 0.748611111111111 | 0 |
| 0.7493055555555556 | 0 |
| 0.75 | 0 |
| 0.7506944444444444 | 0 |
| 0.751388888888889 | 0 |
| 0.7520833333333333 | 0 |
| 0.7527777777777778 | 0 |
| 0.7534722222222222 | 0 |
| 0.7541666666666668 | 0 |
| 0.7548611111111111 | 0 |
| 0.7555555555555555 | 0 |
| 0.75625 | 0 |
| 0.7569444444444445 | 0 |
| 0.7576388888888889 | 0 |
| 0.7583333333333333 | 0 |
| 0.7590277777777777 | 0 |
| 0.7597222222222223 | 0 |
| 0.7604166666666666 | 0 |
| 0.7611111111111111 | 0 |
| 0.7618055555555556 | 0 |
| 0.7625000000000001 | 0 |
| 0.7631944444444444 | 0 |
| 0.7638888888888888 | 0 |
| 0.7645833333333334 | 0 |
| 0.7652777777777778 | 0 |
| 0.7659722222222222 | 0 |
| 0.7666666666666666 | 0 |
| 0.7673611111111112 | 0 |
| 0.7680555555555556 | 0 |
| 0.7687499999999999 | 0 |
| 0.7694444444444444 | 0 |
| 0.7701388888888889 | 0 |
| 0.7708333333333334 | 0 |
| 0.7715277777777777 | 0 |
| 0.7722222222222223 | 0 |
| 0.7729166666666667 | 0 |
| 0.7736111111111111 | 0 |
| 0.7743055555555555 | 0 |
| 0.775 | 0 |
| 0.7756944444444445 | 0 |
| 0.7763888888888889 | 0 |
| 0.7770833333333332 | 0 |
| 0.7777777777777778 | 0 |
| 0.7784722222222222 | 0 |
| 0.7791666666666667 | 0 |
| 0.779861111111111 | 0 |
| 0.7805555555555556 | 0 |
| 0.78125 | 0 |
| 0.7819444444444444 | 0 |
| 0.782638888888889 | 0 |
| 0.7833333333333333 | 0 |
| 0.7840277777777778 | 0 |
| 0.7847222222222222 | 0 |
| 0.7854166666666668 | 0 |
| 0.7861111111111111 | 0 |
| 0.7868055555555555 | 0 |
| 0.7875 | 0 |
| 0.7881944444444445 | 0 |
| 0.7888888888888889 | 0 |
| 0.7895833333333333 | 0 |
| 0.7902777777777777 | 0 |
| 0.7909722222222223 | 0 |
| 0.7916666666666666 | 0 |
| 0.7923611111111111 | 0 |
| 0.7930555555555556 | 0 |
| 0.7937500000000001 | 0 |
| 0.7944444444444444 | 0 |
| 0.7951388888888888 | 0 |
| 0.7958333333333334 | 0 |
| 0.7965277777777778 | 0 |
| 0.7972222222222222 | 0 |
| 0.7979166666666666 | 0 |
| 0.7986111111111112 | 0 |
| 0.7993055555555556 | 0 |
| 0.7999999999999999 | 0 |
| 0.8006944444444444 | 0 |
| 0.8013888888888889 | 0 |
| 0.8020833333333334 | 0 |
| 0.8027777777777777 | 0 |
| 0.8034722222222223 | 0 |
| 0.8041666666666667 | 0 |
| 0.8048611111111111 | 0 |
| 0.8055555555555555 | 0 |
| 0.80625 | 0 |
| 0.8069444444444445 | 0 |
| 0.8076388888888889 | 0 |
| 0.8083333333333332 | 0 |
| 0.8090277777777778 | 0 |
| 0.8097222222222222 | 0 |
| 0.8104166666666667 | 0 |
| 0.811111111111111 | 0 |
| 0.8118055555555556 | 0 |
| 0.8125 | 0 |
| 0.8131944444444444 | 0 |
| 0.813888888888889 | 0 |
| 0.8145833333333333 | 0 |
| 0.8152777777777778 | 0 |
| 0.8159722222222222 | 0 |
| 0.8166666666666668 | 0 |
| 0.8173611111111111 | 0 |
| 0.8180555555555555 | 0 |
| 0.81875 | 0 |
| 0.8194444444444445 | 0 |
| 0.8201388888888889 | 0 |
| 0.8208333333333333 | 0 |
| 0.8215277777777777 | 0 |
| 0.8222222222222223 | 0 |
| 0.8229166666666666 | 0 |
| 0.8236111111111111 | 0 |
| 0.8243055555555556 | 0 |
| 0.8250000000000001 | 0 |
| 0.8256944444444444 | 0 |
| 0.8263888888888888 | 0 |
| 0.8270833333333334 | 0 |
| 0.8277777777777778 | 0 |
| 0.8284722222222222 | 0 |
| 0.8291666666666666 | 0 |
| 0.8298611111111112 | 0 |
| 0.8305555555555556 | 0 |
| 0.8312499999999999 | 0 |
| 0.8319444444444444 | 0 |
| 0.8326388888888889 | 0 |
| 0.8333333333333334 | 0 |
| 0.8340277777777777 | 0 |
| 0.8347222222222223 | 0 |
| 0.8354166666666667 | 0 |
| 0.8361111111111111 | 0 |
| 0.8368055555555555 | 0 |
| 0.8375 | 0 |
| 0.8381944444444445 | 0 |
| 0.8388888888888889 | 0 |
| 0.8395833333333332 | 0 |
| 0.8402777777777778 | 0 |
| 0.8409722222222222 | 0 |
| 0.8416666666666667 | 0 |
| 0.842361111111111 | 0 |
| 0.8430555555555556 | 0 |
| 0.84375 | 0 |
| 0.8444444444444444 | 0 |
| 0.845138888888889 | 0 |
| 0.8458333333333333 | 0 |
| 0.8465277777777778 | 0 |
| 0.8472222222222222 | 0 |
| 0.8479166666666668 | 0 |
| 0.8486111111111111 | 0 |
| 0.8493055555555555 | 0 |
| 0.85 | 0 |
| 0.8506944444444445 | 0 |
| 0.8513888888888889 | 0 |
| 0.8520833333333333 | 0 |
| 0.8527777777777777 | 0 |
| 0.8534722222222223 | 0 |
| 0.8541666666666666 | 0 |
| 0.8548611111111111 | 0 |
| 0.8555555555555556 | 0 |
| 0.8562500000000001 | 0 |
| 0.8569444444444444 | 0 |
| 0.8576388888888888 | 0 |
| 0.8583333333333334 | 0 |
| 0.8590277777777778 | 0 |
| 0.8597222222222222 | 0 |
| 0.8604166666666666 | 0 |
| 0.8611111111111112 | 0 |
| 0.8618055555555556 | 0 |
| 0.8624999999999999 | 0 |
| 0.8631944444444444 | 0 |
| 0.8638888888888889 | 0 |
| 0.8645833333333334 | 0 |
| 0.8652777777777777 | 0 |
| 0.8659722222222223 | 0 |
| 0.8666666666666667 | 0 |
| 0.8673611111111111 | 0 |
| 0.8680555555555555 | 0 |
| 0.86875 | 0 |
| 0.8694444444444445 | 0 |
| 0.8701388888888889 | 0 |
| 0.8708333333333332 | 0 |
| 0.8715277777777778 | 0 |
| 0.8722222222222222 | 0 |
| 0.8729166666666667 | 0 |
| 0.873611111111111 | 0 |
| 0.8743055555555556 | 0 |
| 0.875 | 0 |
| 0.8756944444444444 | 0 |
| 0.876388888888889 | 0 |
| 0.8770833333333333 | 0 |
| 0.8777777777777778 | 0 |
| 0.8784722222222222 | 0 |
| 0.8791666666666668 | 0 |
| 0.8798611111111111 | 0 |
| 0.8805555555555555 | 0 |
| 0.88125 | 0 |
| 0.8819444444444445 | 0 |
| 0.8826388888888889 | 0 |
| 0.8833333333333333 | 0 |
| 0.8840277777777777 | 0 |
| 0.8847222222222223 | 0 |
| 0.8854166666666666 | 0 |
| 0.8861111111111111 | 0 |
| 0.8868055555555556 | 0 |
| 0.8875000000000001 | 0 |
| 0.8881944444444444 | 0 |
| 0.8888888888888888 | 0 |
| 0.8895833333333334 | 0 |
| 0.8902777777777778 | 0 |
| 0.8909722222222222 | 0 |
| 0.8916666666666666 | 0 |
| 0.8923611111111112 | 0 |
| 0.8930555555555556 | 0 |
| 0.8937499999999999 | 0 |
| 0.8944444444444444 | 0 |
| 0.8951388888888889 | 0 |
| 0.8958333333333334 | 0 |
| 0.8965277777777777 | 0 |
| 0.8972222222222223 | 0 |
| 0.8979166666666667 | 0 |
| 0.8986111111111111 | 0 |
| 0.8993055555555555 | 0 |
| 0.9 | 0 |
| 0.9006944444444445 | 0 |
| 0.9013888888888889 | 0 |
| 0.9020833333333332 | 0 |
| 0.9027777777777778 | 0 |
| 0.9034722222222222 | 0 |
| 0.9041666666666667 | 0 |
| 0.904861111111111 | 0 |
| 0.9055555555555556 | 0 |
| 0.90625 | 0 |
| 0.9069444444444444 | 0 |
| 0.907638888888889 | 0 |
| 0.9083333333333333 | 0 |
| 0.9090277777777778 | 0 |
| 0.9097222222222222 | 0 |
| 0.9104166666666668 | 0 |
| 0.9111111111111111 | 0 |
| 0.9118055555555555 | 0 |
| 0.9125 | 0 |
| 0.9131944444444445 | 0 |
| 0.9138888888888889 | 0 |
| 0.9145833333333333 | 0 |
| 0.9152777777777777 | 0 |
| 0.9159722222222223 | 0 |
| 0.9166666666666666 | 0 |
| 0.9173611111111111 | 0 |
| 0.9180555555555556 | 0 |
| 0.9187500000000001 | 0 |
| 0.9194444444444444 | 0 |
| 0.9201388888888888 | 0 |
| 0.9208333333333334 | 0 |
| 0.9215277777777778 | 0 |
| 0.9222222222222222 | 0 |
| 0.9229166666666666 | 0 |
| 0.9236111111111112 | 0 |
| 0.9243055555555556 | 0 |
| 0.9249999999999999 | 0 |
| 0.9256944444444444 | 0 |
| 0.9263888888888889 | 0 |
| 0.9270833333333334 | 0 |
| 0.9277777777777777 | 0 |
| 0.9284722222222223 | 0 |
| 0.9291666666666667 | 0 |
| 0.9298611111111111 | 0 |
| 0.9305555555555555 | 0 |
| 0.93125 | 0 |
| 0.9319444444444445 | 0 |
| 0.9326388888888889 | 0 |
| 0.9333333333333332 | 0 |
| 0.9340277777777778 | 0 |
| 0.9347222222222222 | 0 |
| 0.9354166666666667 | 0 |
| 0.936111111111111 | 0 |
| 0.9368055555555556 | 0 |
| 0.9375 | 0 |
| 0.9381944444444444 | 0 |
| 0.938888888888889 | 0 |
| 0.9395833333333333 | 0 |
| 0.9402777777777778 | 0 |
| 0.9409722222222222 | 0 |
| 0.9416666666666668 | 0 |
| 0.9423611111111111 | 0 |
| 0.9430555555555555 | 0 |
| 0.94375 | 0 |
| 0.9444444444444445 | 0 |
| 0.9451388888888889 | 0 |
| 0.9458333333333333 | 0 |
| 0.9465277777777777 | 0 |
| 0.9472222222222223 | 0 |
| 0.9479166666666666 | 0 |
| 0.9486111111111111 | 0 |
| 0.9493055555555556 | 0 |
| 0.9500000000000001 | 0 |
| 0.9506944444444444 | 0 |
| 0.9513888888888888 | 0 |
| 0.9520833333333334 | 0 |
| 0.9527777777777778 | 0 |
| 0.9534722222222222 | 0 |
| 0.9541666666666666 | 0 |
| 0.9548611111111112 | 0 |
| 0.9555555555555556 | 0 |
| 0.9562499999999999 | 0 |
| 0.9569444444444444 | 0 |
| 0.9576388888888889 | 0 |
| 0.9583333333333334 | 0 |
| 0.9590277777777777 | 0 |
| 0.9597222222222223 | 0 |
| 0.9604166666666667 | 0 |
| 0.9611111111111111 | 0 |
| 0.9618055555555555 | 0 |
| 0.9625 | 0 |
| 0.9631944444444445 | 0 |
| 0.9638888888888889 | 0 |
| 0.9645833333333332 | 0 |
| 0.9652777777777778 | 0 |
| 0.9659722222222222 | 0 |
| 0.9666666666666667 | 0 |
| 0.967361111111111 | 0 |
| 0.9680555555555556 | 0 |
| 0.96875 | 0 |
| 0.9694444444444444 | 0 |
| 0.970138888888889 | 0 |
| 0.9708333333333333 | 0 |
| 0.9715277777777778 | 0 |
| 0.9722222222222222 | 0 |
| 0.9729166666666668 | 0 |
| 0.9736111111111111 | 0 |
| 0.9743055555555555 | 0 |
| 0.975 | 0 |
| 0.9756944444444445 | 0 |
| 0.9763888888888889 | 0 |
| 0.9770833333333333 | 0 |
| 0.9777777777777777 | 0 |
| 0.9784722222222223 | 0 |
| 0.9791666666666666 | 0 |
| 0.9798611111111111 | 0 |
| 0.9805555555555556 | 0 |
| 0.9812500000000001 | 0 |
| 0.9819444444444444 | 0 |
| 0.9826388888888888 | 0 |
| 0.9833333333333334 | 0 |
| 0.9840277777777778 | 0 |
| 0.9847222222222222 | 0 |
| 0.9854166666666666 | 0 |
| 0.9861111111111112 | 0 |
| 0.9868055555555556 | 0 |
| 0.9874999999999999 | 0 |
| 0.9881944444444444 | 0 |
| 0.9888888888888889 | 0 |
| 0.9895833333333334 | 0 |
| 0.9902777777777777 | 0 |
| 0.9909722222222223 | 0 |
| 0.9916666666666667 | 0 |
| 0.9923611111111111 | 0 |
| 0.9930555555555555 | 0 |
| 0.99375 | 0 |
| 0.9944444444444445 | 0 |
| 0.9951388888888889 | 0 |
| 0.9958333333333332 | 0 |
| 0.9965277777777778 | 0 |
| 0.9972222222222222 | 0 |
| 0.9979166666666667 | 0 |
| 0.998611111111111 | 0 |
| 0.9993055555555556 | 0 |